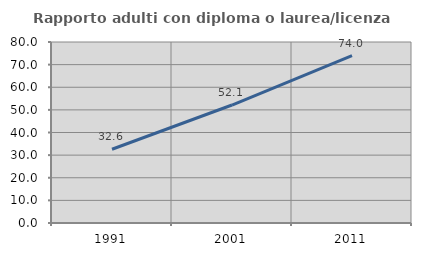
| Category | Rapporto adulti con diploma o laurea/licenza media  |
|---|---|
| 1991.0 | 32.609 |
| 2001.0 | 52.145 |
| 2011.0 | 73.99 |